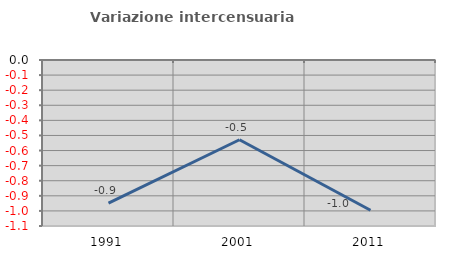
| Category | Variazione intercensuaria annua |
|---|---|
| 1991.0 | -0.949 |
| 2001.0 | -0.529 |
| 2011.0 | -0.996 |